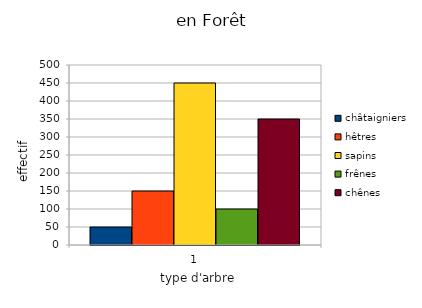
| Category | châtaigniers | hêtres | sapins | frênes  | chênes |
|---|---|---|---|---|---|
| 0 | 50 | 150 | 450 | 100 | 350 |